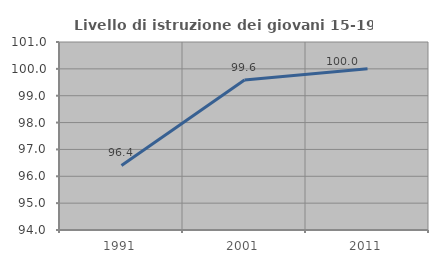
| Category | Livello di istruzione dei giovani 15-19 anni |
|---|---|
| 1991.0 | 96.402 |
| 2001.0 | 99.588 |
| 2011.0 | 100 |